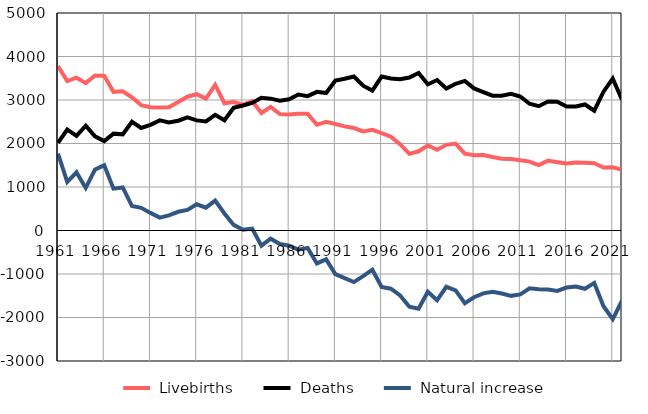
| Category |  Livebirths |  Deaths |  Natural increase |
|---|---|---|---|
| 1961.0 | 3780 | 2013 | 1767 |
| 1962.0 | 3436 | 2319 | 1117 |
| 1963.0 | 3512 | 2176 | 1336 |
| 1964.0 | 3388 | 2409 | 979 |
| 1965.0 | 3565 | 2165 | 1400 |
| 1966.0 | 3555 | 2056 | 1499 |
| 1967.0 | 3188 | 2226 | 962 |
| 1968.0 | 3201 | 2211 | 990 |
| 1969.0 | 3062 | 2500 | 562 |
| 1970.0 | 2880 | 2358 | 522 |
| 1971.0 | 2833 | 2428 | 405 |
| 1972.0 | 2828 | 2531 | 297 |
| 1973.0 | 2833 | 2484 | 349 |
| 1974.0 | 2954 | 2524 | 430 |
| 1975.0 | 3075 | 2601 | 474 |
| 1976.0 | 3133 | 2531 | 602 |
| 1977.0 | 3032 | 2507 | 525 |
| 1978.0 | 3346 | 2659 | 687 |
| 1979.0 | 2925 | 2534 | 391 |
| 1980.0 | 2952 | 2823 | 129 |
| 1981.0 | 2890 | 2874 | 16 |
| 1982.0 | 2975 | 2932 | 43 |
| 1983.0 | 2702 | 3051 | -349 |
| 1984.0 | 2842 | 3031 | -189 |
| 1985.0 | 2675 | 2986 | -311 |
| 1986.0 | 2665 | 3015 | -350 |
| 1987.0 | 2684 | 3125 | -441 |
| 1988.0 | 2685 | 3089 | -404 |
| 1989.0 | 2430 | 3187 | -757 |
| 1990.0 | 2497 | 3160 | -663 |
| 1991.0 | 2448 | 3449 | -1001 |
| 1992.0 | 2394 | 3488 | -1094 |
| 1993.0 | 2355 | 3541 | -1186 |
| 1994.0 | 2279 | 3329 | -1050 |
| 1995.0 | 2316 | 3217 | -901 |
| 1996.0 | 2241 | 3539 | -1298 |
| 1997.0 | 2158 | 3496 | -1338 |
| 1998.0 | 1985 | 3477 | -1492 |
| 1999.0 | 1763 | 3516 | -1753 |
| 2000.0 | 1821 | 3621 | -1800 |
| 2001.0 | 1956 | 3363 | -1407 |
| 2002.0 | 1856 | 3459 | -1603 |
| 2003.0 | 1969 | 3263 | -1294 |
| 2004.0 | 1997 | 3373 | -1376 |
| 2005.0 | 1767 | 3438 | -1671 |
| 2006.0 | 1731 | 3266 | -1535 |
| 2007.0 | 1736 | 3180 | -1444 |
| 2008.0 | 1690 | 3098 | -1408 |
| 2009.0 | 1649 | 3099 | -1450 |
| 2010.0 | 1642 | 3144 | -1502 |
| 2011.0 | 1613 | 3081 | -1468 |
| 2012.0 | 1583 | 2913 | -1330 |
| 2013.0 | 1505 | 2858 | -1353 |
| 2014.0 | 1606 | 2964 | -1358 |
| 2015.0 | 1571 | 2960 | -1389 |
| 2016.0 | 1538 | 2850 | -1312 |
| 2017.0 | 1561 | 2849 | -1288 |
| 2018.0 | 1557 | 2897 | -1340 |
| 2019.0 | 1548 | 2753 | -1205 |
| 2020.0 | 1449 | 3191 | -1742 |
| 2021.0 | 1454 | 3492 | -2038 |
| 2022.0 | 1395 | 3008 | -1613 |